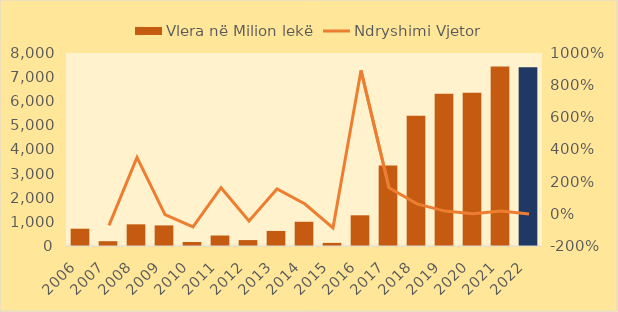
| Category | Vlera në Milion lekë |
|---|---|
| 2006.0 | 716.061 |
| 2007.0 | 199.081 |
| 2008.0 | 898.015 |
| 2009.0 | 853.767 |
| 2010.0 | 165.841 |
| 2011.0 | 435.47 |
| 2012.0 | 245.071 |
| 2013.0 | 624.719 |
| 2014.0 | 1004.843 |
| 2015.0 | 128.325 |
| 2016.0 | 1272.832 |
| 2017.0 | 3334.883 |
| 2018.0 | 5398.329 |
| 2019.0 | 6315.307 |
| 2020.0 | 6350.959 |
| 2021.0 | 7438.142 |
| 2022.0 | 7414.036 |